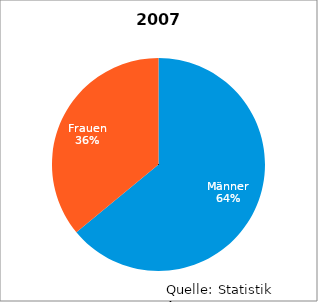
| Category | 2007 |
|---|---|
| Männer | 153 |
| Frauen | 86 |